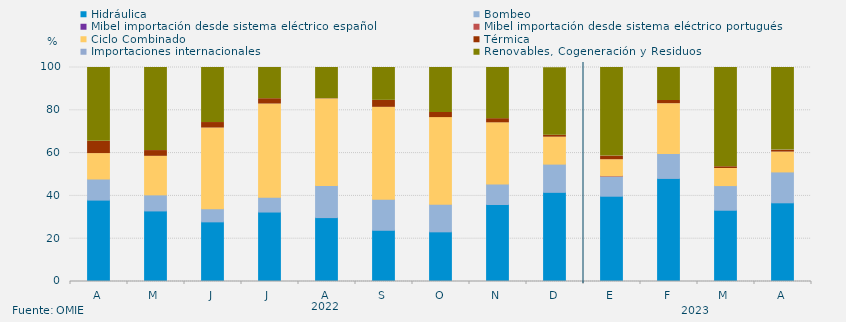
| Category | Hidráulica | Bombeo | Mibel importación desde sistema eléctrico español | Mibel importación desde sistema eléctrico portugués | Ciclo Combinado | Térmica | Importaciones internacionales | Renovables, Cogeneración y Residuos |
|---|---|---|---|---|---|---|---|---|
| A | 38.032 | 9.861 | 0 | 0 | 11.875 | 5.741 | 0 | 34.491 |
| M | 32.975 | 7.504 | 0 | 0 | 18.011 | 2.688 | 0 | 38.822 |
| J | 27.87 | 6.134 | 0 | 0 | 37.708 | 2.569 | 0 | 25.718 |
| J | 32.46 | 6.855 | 0 | 0 | 43.616 | 2.487 | 0 | 14.583 |
| A | 29.861 | 14.964 | 0 | 0 | 40.479 | 0.134 | 0 | 14.561 |
| S | 23.935 | 14.514 | 0 | 0 | 42.94 | 3.264 | 0 | 15.347 |
| O | 23.208 | 12.926 | 0 | 0 | 40.457 | 2.419 | 0 | 20.99 |
| N | 35.972 | 9.537 | 0 | 0 | 28.634 | 1.944 | 0 | 23.912 |
| D | 41.662 | 13.19 | 0 | 0 | 12.59 | 0.914 | 0 | 31.537 |
| E | 39.852 | 9.42 | 0 | 0.134 | 7.493 | 1.703 | 0 | 41.398 |
| F | 48.165 | 11.657 | 0 | 0 | 23.264 | 1.488 | 0 | 15.427 |
| M | 33.3 | 11.519 | 0 | 0 | 7.974 | 0.83 | 0 | 46.377 |
| A | 36.771 | 14.433 | 0 | 0 | 9.271 | 0.88 | 0.069 | 38.576 |